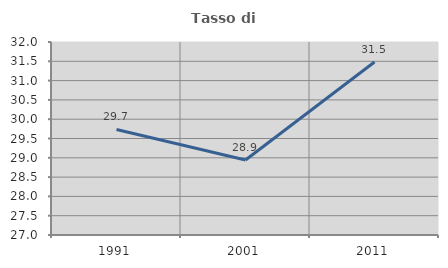
| Category | Tasso di occupazione   |
|---|---|
| 1991.0 | 29.735 |
| 2001.0 | 28.942 |
| 2011.0 | 31.483 |